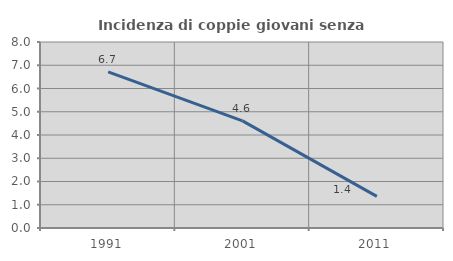
| Category | Incidenza di coppie giovani senza figli |
|---|---|
| 1991.0 | 6.716 |
| 2001.0 | 4.605 |
| 2011.0 | 1.361 |